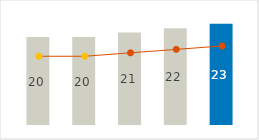
| Category | Freight & Forwarding |
|---|---|
| 0 | 20 |
| 1 | 20 |
| 2 | 21 |
| 3 | 22 |
| 4 | 23 |